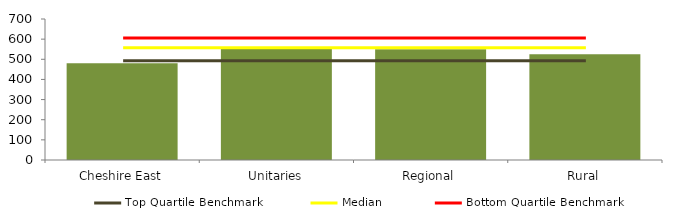
| Category | Block Data |
|---|---|
| Cheshire East | 480 |
| Unitaries | 552.176 |
| Regional | 549.433 |
|  Rural  | 525.49 |